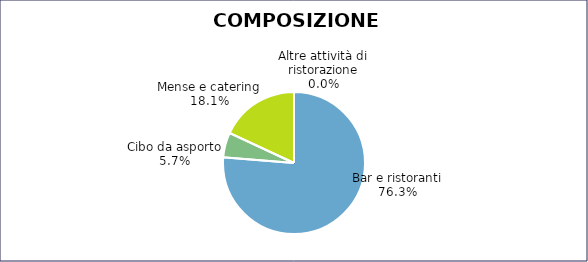
| Category | Series 0 |
|---|---|
| Bar e ristoranti | 11972 |
| Cibo da asporto | 888 |
| Mense e catering | 2834 |
| Altre attività di ristorazione | 0 |